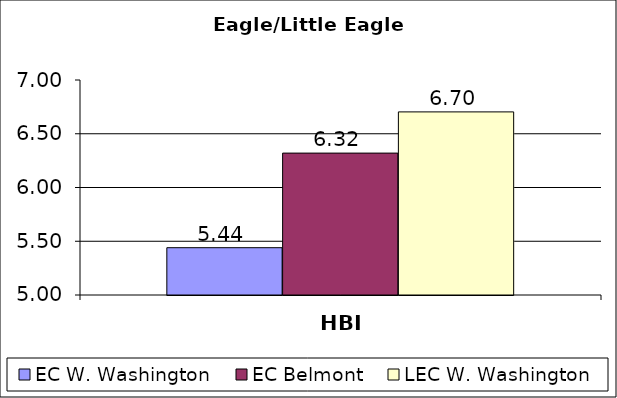
| Category | EC W. Washington | EC Belmont | LEC W. Washington |
|---|---|---|---|
| HBI | 5.44 | 6.32 | 6.703 |